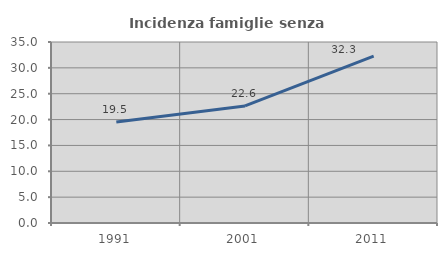
| Category | Incidenza famiglie senza nuclei |
|---|---|
| 1991.0 | 19.537 |
| 2001.0 | 22.642 |
| 2011.0 | 32.258 |